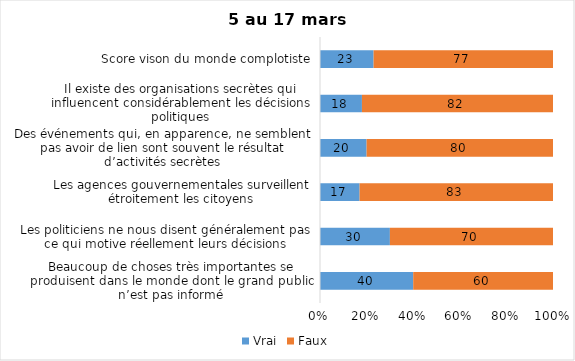
| Category | Vrai | Faux |
|---|---|---|
| Beaucoup de choses très importantes se produisent dans le monde dont le grand public n’est pas informé | 40 | 60 |
| Les politiciens ne nous disent généralement pas ce qui motive réellement leurs décisions | 30 | 70 |
| Les agences gouvernementales surveillent étroitement les citoyens | 17 | 83 |
| Des événements qui, en apparence, ne semblent pas avoir de lien sont souvent le résultat d’activités secrètes | 20 | 80 |
| Il existe des organisations secrètes qui influencent considérablement les décisions politiques | 18 | 82 |
| Score vison du monde complotiste | 23 | 77 |